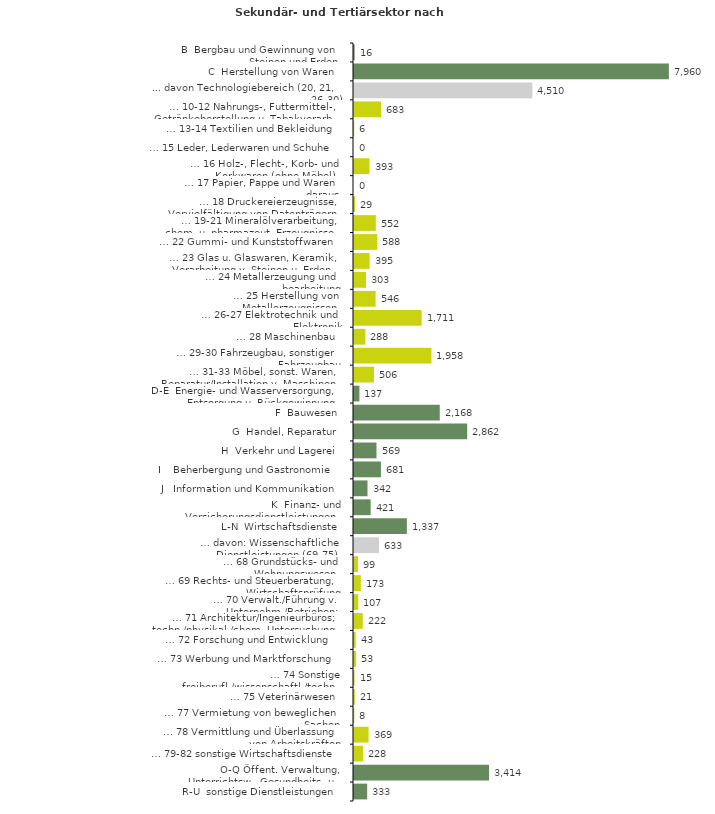
| Category | Series 0 |
|---|---|
| B  Bergbau und Gewinnung von Steinen und Erden | 16 |
| C  Herstellung von Waren | 7960 |
| ... davon Technologiebereich (20, 21, 26-30) | 4510 |
| … 10-12 Nahrungs-, Futtermittel-, Getränkeherstellung u. Tabakverarb. | 683 |
| … 13-14 Textilien und Bekleidung | 6 |
| … 15 Leder, Lederwaren und Schuhe | 0 |
| … 16 Holz-, Flecht-, Korb- und Korkwaren (ohne Möbel)  | 393 |
| … 17 Papier, Pappe und Waren daraus  | 0 |
| … 18 Druckereierzeugnisse, Vervielfältigung von Datenträgern | 29 |
| … 19-21 Mineralölverarbeitung, chem. u. pharmazeut. Erzeugnisse | 552 |
| … 22 Gummi- und Kunststoffwaren | 588 |
| … 23 Glas u. Glaswaren, Keramik, Verarbeitung v. Steinen u. Erden  | 395 |
| … 24 Metallerzeugung und -bearbeitung | 303 |
| … 25 Herstellung von Metallerzeugnissen  | 546 |
| … 26-27 Elektrotechnik und Elektronik | 1711 |
| … 28 Maschinenbau | 288 |
| … 29-30 Fahrzeugbau, sonstiger Fahrzeugbau | 1958 |
| … 31-33 Möbel, sonst. Waren, Reparatur/Installation v. Maschinen | 506 |
| D-E  Energie- und Wasserversorgung, Entsorgung u. Rückgewinnung | 137 |
| F  Bauwesen | 2168 |
| G  Handel, Reparatur | 2862 |
| H  Verkehr und Lagerei | 569 |
| I    Beherbergung und Gastronomie | 681 |
| J   Information und Kommunikation | 342 |
| K  Finanz- und Versicherungsdienstleistungen | 421 |
| L-N  Wirtschaftsdienste | 1337 |
| … davon: Wissenschaftliche Dienstleistungen (69-75) | 633 |
| … 68 Grundstücks- und Wohnungswesen  | 99 |
| … 69 Rechts- und Steuerberatung, Wirtschaftsprüfung | 173 |
| … 70 Verwalt./Führung v. Unternehm./Betrieben; Unternehmensberat. | 107 |
| … 71 Architektur/Ingenieurbüros; techn./physikal./chem. Untersuchung | 222 |
| … 72 Forschung und Entwicklung  | 43 |
| … 73 Werbung und Marktforschung | 53 |
| … 74 Sonstige freiberufl./wissenschaftl./techn. Tätigkeiten | 15 |
| … 75 Veterinärwesen | 21 |
| … 77 Vermietung von beweglichen Sachen  | 8 |
| … 78 Vermittlung und Überlassung von Arbeitskräften | 369 |
| … 79-82 sonstige Wirtschaftsdienste | 228 |
| O-Q Öffent. Verwaltung, Unterrichtsw., Gesundheits- u. Sozialwesen | 3414 |
| R-U  sonstige Dienstleistungen | 333 |